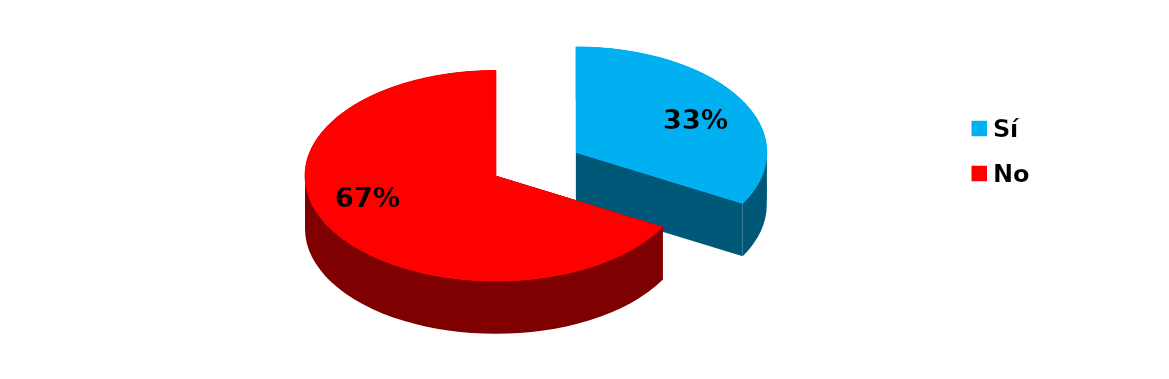
| Category | Series 0 |
|---|---|
| Sí | 42 |
| No | 85 |